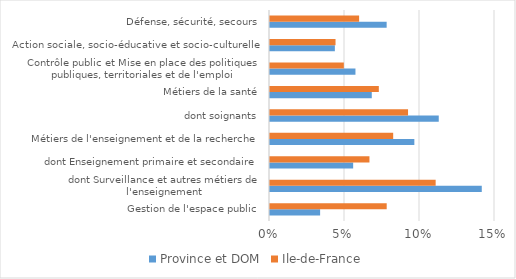
| Category | Province et DOM | Ile-de-France |
|---|---|---|
| Gestion de l'espace public | 0.033 | 0.078 |
| dont Surveillance et autres métiers de l'enseignement | 0.141 | 0.11 |
| dont Enseignement primaire et secondaire | 0.055 | 0.066 |
| Métiers de l'enseignement et de la recherche | 0.096 | 0.082 |
| dont soignants | 0.112 | 0.092 |
| Métiers de la santé | 0.068 | 0.073 |
| Contrôle public et Mise en place des politiques publiques, territoriales et de l'emploi | 0.057 | 0.049 |
| Action sociale, socio-éducative et socio-culturelle | 0.043 | 0.044 |
| Défense, sécurité, secours | 0.078 | 0.059 |